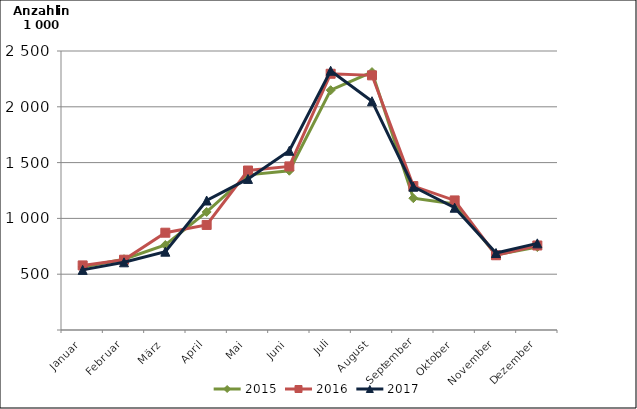
| Category | 2015 | 2016 | 2017 |
|---|---|---|---|
| Januar | 564.707 | 578.669 | 538.58 |
| Februar | 634.326 | 629.84 | 606.549 |
| März | 761.478 | 871.799 | 701.814 |
| April | 1057.691 | 941.395 | 1160.421 |
| Mai | 1390.361 | 1428.994 | 1353.809 |
| Juni | 1427.202 | 1465.871 | 1605.779 |
| Juli | 2148.876 | 2296.074 | 2323.024 |
| August | 2311.123 | 2281.92 | 2050.191 |
| September | 1181.026 | 1289.414 | 1283.906 |
| Oktober | 1128.909 | 1161.073 | 1095.592 |
| November | 672.352 | 669.913 | 689.883 |
| Dezember | 743.18 | 757.3 | 776.478 |